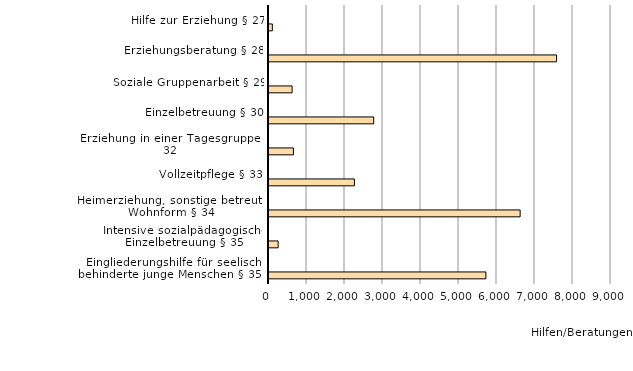
| Category | Series 0 | Series 1 | Series 2 |
|---|---|---|---|
| Eingliederungshilfe für seelisch
behinderte junge Menschen § 35a | 5708 |  |  |
| Intensive sozialpädagogische Einzelbetreuung § 35 | 241 |  |  |
| Heimerziehung, sonstige betreute Wohnform § 34 | 6609 |  |  |
| Vollzeitpflege § 33 | 2247 |  |  |
| Erziehung in einer Tagesgruppe § 32 | 642 |  |  |
| Einzelbetreuung § 30 | 2755 |  |  |
| Soziale Gruppenarbeit § 29 | 608 |  |  |
| Erziehungsberatung § 28 | 7568 |  |  |
| Hilfe zur Erziehung § 27 | 88 |  |  |